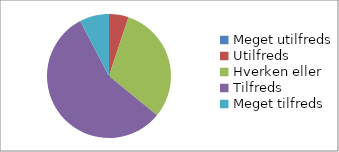
| Category | Hvor tilfreds er du med oplægget 'Paletten af samarbejdsmuligheder mellem ingeniøruddannelserne og virksomhederne'? (n=39) |
|---|---|
| Meget utilfreds | 0 |
| Utilfreds | 0.051 |
| Hverken eller | 0.308 |
| Tilfreds | 0.564 |
| Meget tilfreds | 0.077 |